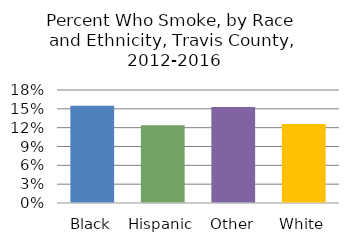
| Category | Series 0 |
|---|---|
| Black | 0.155 |
| Hispanic | 0.124 |
| Other | 0.153 |
| White | 0.126 |